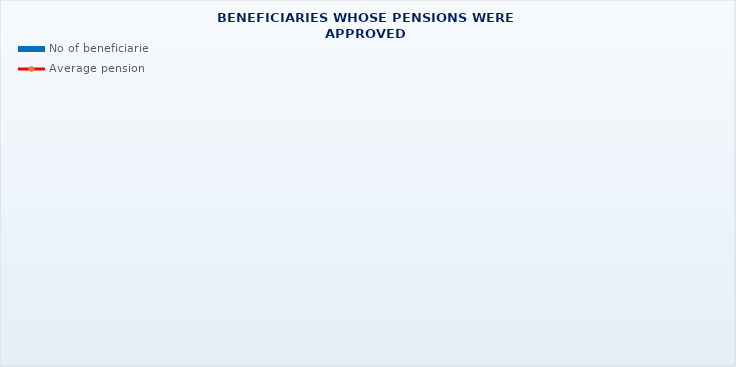
| Category | No of beneficiaries |
|---|---|
| Authorised officials in internal affairs, judicial officers and workers engaged in demining work: | 17264 |
| Active military personnel - DVO  | 15629 |
| Croatian Homeland Army veterans mobilised from 1941 to 1945 | 4186 |
| Former political prisoners | 2839 |
| Croatian Veterans from the Homeland War - ZOHBDR (Act on the Rights of Croatian Homeland War Veterans and their Family Members) | 71239 |
| Pensions approved under general regulations and determined according to the Act on the Rights of Croatian Homeland War Veterans and their Family Members (ZOHBDR), in 2017 (Art. 27, 35, 48 and 49, paragraph 2)    | 42093 |
| Former Yugoslav People's Army members - JNA   | 5504 |
| Former Yugoslav People's Army members - JNA - Art. 185 of Pension Insurance Act (ZOMO)  | 142 |
| National Liberation War veterans - NOR | 9910 |
| Members of the Croatian Parliament, members of the Government, judges of the Constitutional Court and the Auditor General | 673 |
| Members of the Parliamentary Executive Council and administratively retired federal civil servants  (relates to the former SFRY) | 96 |
| Former officials of federal bodies o the former SFRJ -  Article 38 of the Pension Insurance Act (ZOMO) | 34 |
| Full members of the Croatian Academy of Sciences and Arts - HAZU | 140 |
| Miners from the Istrian coal mines "Tupljak" d.d. Labin  | 254 |
| Workers professionally exposed to asbestos | 867 |
| Insurees - crew members on a ship in international and national navigation  - Article  129, paragraph 2 of the Maritime Code | 172 |
| Members of the Croatian Defence Council - HVO  | 6735 |